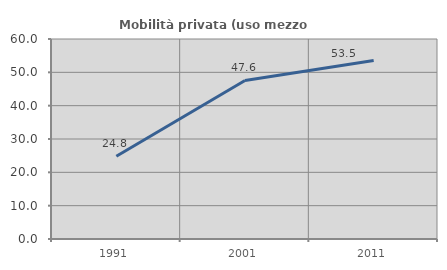
| Category | Mobilità privata (uso mezzo privato) |
|---|---|
| 1991.0 | 24.803 |
| 2001.0 | 47.556 |
| 2011.0 | 53.524 |